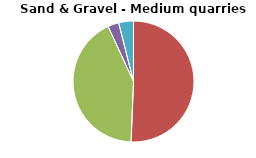
| Category | Series 0 |
|---|---|
| DRILLING AND BLASTING | 0 |
| MATERIAL PROCESSING | 15.565 |
| INTERNAL TRANSPORT | 13.058 |
| MATERIAL HANDLING OPERATION | 0.902 |
| WIND EROSION FROM STOCKPILES | 1.215 |